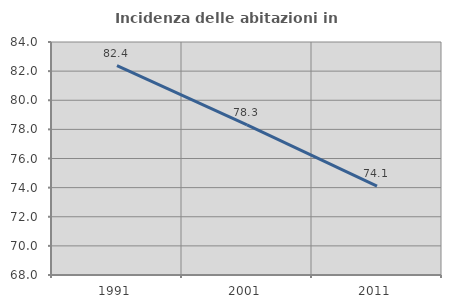
| Category | Incidenza delle abitazioni in proprietà  |
|---|---|
| 1991.0 | 82.377 |
| 2001.0 | 78.313 |
| 2011.0 | 74.104 |